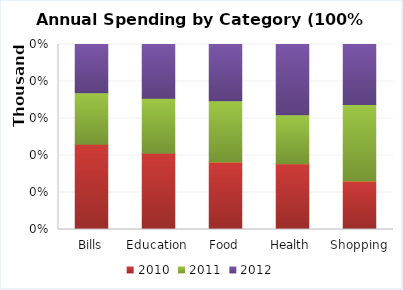
| Category | 2010 | 2011 | 2012 |
|---|---|---|---|
| Bills | 3785.581 | 2291.988 | 2145.344 |
| Education | 5893.992 | 4242.892 | 4150.561 |
| Food | 11655.462 | 10520.331 | 9714.334 |
| Health | 3379.324 | 2504.892 | 3607.436 |
| Shopping | 4075.61 | 6415.392 | 5046.717 |